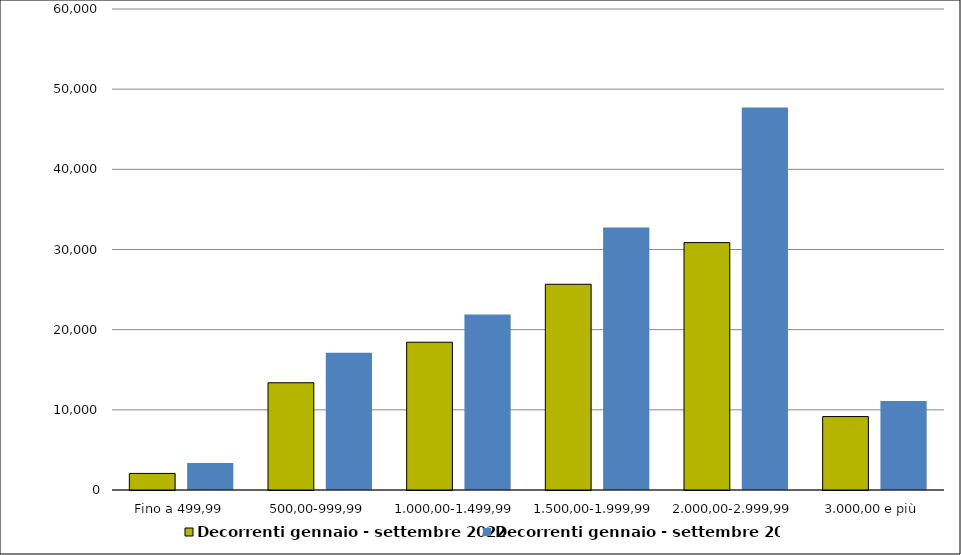
| Category | Decorrenti gennaio - settembre 2022 | Decorrenti gennaio - settembre 2021 |
|---|---|---|
| Fino a 499,99 | 2069 | 3359 |
| 500,00-999,99 | 13378 | 17132 |
| 1.000,00-1.499,99 | 18434 | 21889 |
| 1.500,00-1.999,99 | 25662 | 32735 |
| 2.000,00-2.999,99 | 30860 | 47725 |
| 3.000,00 e più | 9159 | 11102 |